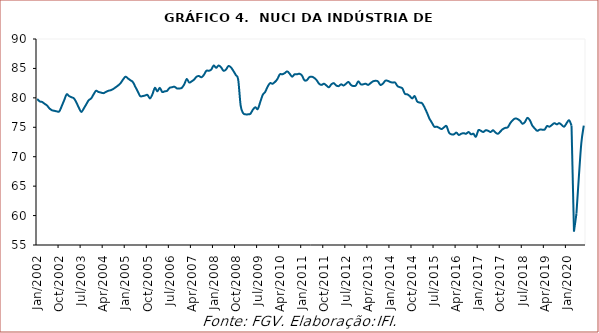
| Category | Nuci |
|---|---|
| 2002-01-01 | 79.8 |
| 2002-02-01 | 79.4 |
| 2002-03-01 | 79.3 |
| 2002-04-01 | 79 |
| 2002-05-01 | 78.7 |
| 2002-06-01 | 78.2 |
| 2002-07-01 | 77.9 |
| 2002-08-01 | 77.8 |
| 2002-09-01 | 77.7 |
| 2002-10-01 | 77.7 |
| 2002-11-01 | 78.6 |
| 2002-12-01 | 79.6 |
| 2003-01-01 | 80.6 |
| 2003-02-01 | 80.3 |
| 2003-03-01 | 80.1 |
| 2003-04-01 | 79.9 |
| 2003-05-01 | 79.2 |
| 2003-06-01 | 78.3 |
| 2003-07-01 | 77.6 |
| 2003-08-01 | 78.2 |
| 2003-09-01 | 78.9 |
| 2003-10-01 | 79.6 |
| 2003-11-01 | 79.9 |
| 2003-12-01 | 80.6 |
| 2004-01-01 | 81.2 |
| 2004-02-01 | 81 |
| 2004-03-01 | 80.9 |
| 2004-04-01 | 80.8 |
| 2004-05-01 | 81 |
| 2004-06-01 | 81.2 |
| 2004-07-01 | 81.3 |
| 2004-08-01 | 81.5 |
| 2004-09-01 | 81.8 |
| 2004-10-01 | 82.1 |
| 2004-11-01 | 82.5 |
| 2004-12-01 | 83.1 |
| 2005-01-01 | 83.6 |
| 2005-02-01 | 83.3 |
| 2005-03-01 | 83 |
| 2005-04-01 | 82.7 |
| 2005-05-01 | 81.9 |
| 2005-06-01 | 81.1 |
| 2005-07-01 | 80.3 |
| 2005-08-01 | 80.3 |
| 2005-09-01 | 80.4 |
| 2005-10-01 | 80.5 |
| 2005-11-01 | 79.9 |
| 2005-12-01 | 80.6 |
| 2006-01-01 | 81.7 |
| 2006-02-01 | 81.1 |
| 2006-03-01 | 81.7 |
| 2006-04-01 | 81 |
| 2006-05-01 | 81.1 |
| 2006-06-01 | 81.2 |
| 2006-07-01 | 81.7 |
| 2006-08-01 | 81.8 |
| 2006-09-01 | 81.9 |
| 2006-10-01 | 81.6 |
| 2006-11-01 | 81.6 |
| 2006-12-01 | 81.7 |
| 2007-01-01 | 82.3 |
| 2007-02-01 | 83.2 |
| 2007-03-01 | 82.6 |
| 2007-04-01 | 82.8 |
| 2007-05-01 | 83.1 |
| 2007-06-01 | 83.6 |
| 2007-07-01 | 83.7 |
| 2007-08-01 | 83.5 |
| 2007-09-01 | 83.9 |
| 2007-10-01 | 84.6 |
| 2007-11-01 | 84.6 |
| 2007-12-01 | 84.8 |
| 2008-01-01 | 85.5 |
| 2008-02-01 | 85.1 |
| 2008-03-01 | 85.5 |
| 2008-04-01 | 85.2 |
| 2008-05-01 | 84.6 |
| 2008-06-01 | 84.8 |
| 2008-07-01 | 85.4 |
| 2008-08-01 | 85.2 |
| 2008-09-01 | 84.6 |
| 2008-10-01 | 83.9 |
| 2008-11-01 | 83.1 |
| 2008-12-01 | 78.7 |
| 2009-01-01 | 77.4 |
| 2009-02-01 | 77.2 |
| 2009-03-01 | 77.2 |
| 2009-04-01 | 77.3 |
| 2009-05-01 | 78 |
| 2009-06-01 | 78.4 |
| 2009-07-01 | 78.1 |
| 2009-08-01 | 79.3 |
| 2009-09-01 | 80.5 |
| 2009-10-01 | 81 |
| 2009-11-01 | 81.9 |
| 2009-12-01 | 82.5 |
| 2010-01-01 | 82.4 |
| 2010-02-01 | 82.7 |
| 2010-03-01 | 83.2 |
| 2010-04-01 | 84 |
| 2010-05-01 | 84 |
| 2010-06-01 | 84.2 |
| 2010-07-01 | 84.5 |
| 2010-08-01 | 84.1 |
| 2010-09-01 | 83.6 |
| 2010-10-01 | 84 |
| 2010-11-01 | 84 |
| 2010-12-01 | 84.1 |
| 2011-01-01 | 83.8 |
| 2011-02-01 | 83 |
| 2011-03-01 | 83 |
| 2011-04-01 | 83.5 |
| 2011-05-01 | 83.6 |
| 2011-06-01 | 83.4 |
| 2011-07-01 | 83 |
| 2011-08-01 | 82.4 |
| 2011-09-01 | 82.2 |
| 2011-10-01 | 82.4 |
| 2011-11-01 | 82.1 |
| 2011-12-01 | 81.8 |
| 2012-01-01 | 82.3 |
| 2012-02-01 | 82.5 |
| 2012-03-01 | 82.1 |
| 2012-04-01 | 82 |
| 2012-05-01 | 82.3 |
| 2012-06-01 | 82.1 |
| 2012-07-01 | 82.4 |
| 2012-08-01 | 82.7 |
| 2012-09-01 | 82.2 |
| 2012-10-01 | 82 |
| 2012-11-01 | 82.1 |
| 2012-12-01 | 82.8 |
| 2013-01-01 | 82.3 |
| 2013-02-01 | 82.3 |
| 2013-03-01 | 82.4 |
| 2013-04-01 | 82.2 |
| 2013-05-01 | 82.5 |
| 2013-06-01 | 82.8 |
| 2013-07-01 | 82.9 |
| 2013-08-01 | 82.8 |
| 2013-09-01 | 82.2 |
| 2013-10-01 | 82.4 |
| 2013-11-01 | 82.9 |
| 2013-12-01 | 82.9 |
| 2014-01-01 | 82.7 |
| 2014-02-01 | 82.6 |
| 2014-03-01 | 82.6 |
| 2014-04-01 | 82 |
| 2014-05-01 | 81.8 |
| 2014-06-01 | 81.6 |
| 2014-07-01 | 80.7 |
| 2014-08-01 | 80.6 |
| 2014-09-01 | 80.3 |
| 2014-10-01 | 79.9 |
| 2014-11-01 | 80.3 |
| 2014-12-01 | 79.4 |
| 2015-01-01 | 79.2 |
| 2015-02-01 | 79.1 |
| 2015-03-01 | 78.4 |
| 2015-04-01 | 77.5 |
| 2015-05-01 | 76.5 |
| 2015-06-01 | 75.8 |
| 2015-07-01 | 75.1 |
| 2015-08-01 | 75.1 |
| 2015-09-01 | 74.9 |
| 2015-10-01 | 74.7 |
| 2015-11-01 | 75 |
| 2015-12-01 | 75.2 |
| 2016-01-01 | 74.1 |
| 2016-02-01 | 73.8 |
| 2016-03-01 | 73.8 |
| 2016-04-01 | 74.1 |
| 2016-05-01 | 73.7 |
| 2016-06-01 | 73.9 |
| 2016-07-01 | 74 |
| 2016-08-01 | 73.9 |
| 2016-09-01 | 74.2 |
| 2016-10-01 | 73.8 |
| 2016-11-01 | 73.9 |
| 2016-12-01 | 73.4 |
| 2017-01-01 | 74.5 |
| 2017-02-01 | 74.4 |
| 2017-03-01 | 74.2 |
| 2017-04-01 | 74.5 |
| 2017-05-01 | 74.4 |
| 2017-06-01 | 74.2 |
| 2017-07-01 | 74.5 |
| 2017-08-01 | 74.1 |
| 2017-09-01 | 73.9 |
| 2017-10-01 | 74.3 |
| 2017-11-01 | 74.7 |
| 2017-12-01 | 74.9 |
| 2018-01-01 | 75 |
| 2018-02-01 | 75.7 |
| 2018-03-01 | 76.2 |
| 2018-04-01 | 76.5 |
| 2018-05-01 | 76.4 |
| 2018-06-01 | 76.1 |
| 2018-07-01 | 75.6 |
| 2018-08-01 | 75.9 |
| 2018-09-01 | 76.6 |
| 2018-10-01 | 76.2 |
| 2018-11-01 | 75.3 |
| 2018-12-01 | 74.8 |
| 2019-01-01 | 74.4 |
| 2019-02-01 | 74.6 |
| 2019-03-01 | 74.6 |
| 2019-04-01 | 74.6 |
| 2019-05-01 | 75.2 |
| 2019-06-01 | 75.1 |
| 2019-07-01 | 75.4 |
| 2019-08-01 | 75.7 |
| 2019-09-01 | 75.5 |
| 2019-10-01 | 75.7 |
| 2019-11-01 | 75.4 |
| 2019-12-01 | 75.1 |
| 2020-01-01 | 75.7 |
| 2020-02-01 | 76.2 |
| 2020-03-01 | 75.3 |
| 2020-04-01 | 57.3 |
| 2020-05-01 | 60.3 |
| 2020-06-01 | 66.6 |
| 2020-07-01 | 72.3 |
| 2020-08-01 | 75.3 |